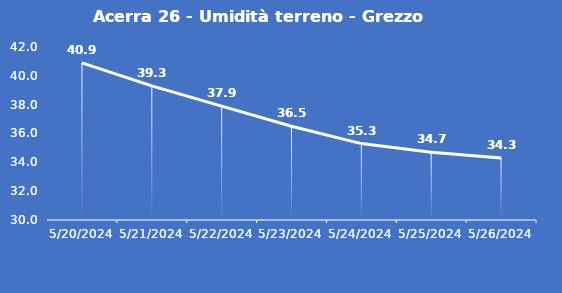
| Category | Acerra 26 - Umidità terreno - Grezzo (%VWC) |
|---|---|
| 5/20/24 | 40.9 |
| 5/21/24 | 39.3 |
| 5/22/24 | 37.9 |
| 5/23/24 | 36.5 |
| 5/24/24 | 35.3 |
| 5/25/24 | 34.7 |
| 5/26/24 | 34.3 |